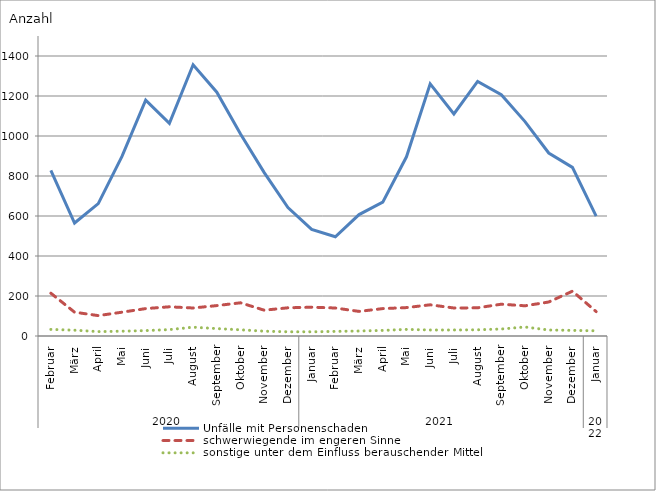
| Category | Unfälle mit Personenschaden | schwerwiegende im engeren Sinne | sonstige unter dem Einfluss berauschender Mittel |
|---|---|---|---|
| 0 | 828 | 214 | 33 |
| 1 | 565 | 119 | 29 |
| 2 | 662 | 102 | 22 |
| 3 | 898 | 119 | 24 |
| 4 | 1179 | 137 | 27 |
| 5 | 1063 | 146 | 32 |
| 6 | 1356 | 140 | 44 |
| 7 | 1219 | 152 | 37 |
| 8 | 1010 | 166 | 31 |
| 9 | 817 | 129 | 24 |
| 10 | 642 | 141 | 21 |
| 11 | 533 | 144 | 21 |
| 12 | 496 | 140 | 23 |
| 13 | 607 | 123 | 25 |
| 14 | 669 | 137 | 28 |
| 15 | 896 | 142 | 33 |
| 16 | 1261 | 156 | 30 |
| 17 | 1110 | 140 | 30 |
| 18 | 1273 | 141 | 31 |
| 19 | 1206 | 159 | 35 |
| 20 | 1072 | 151 | 45 |
| 21 | 915 | 170 | 30 |
| 22 | 843 | 224 | 28 |
| 23 | 599 | 122 | 26 |